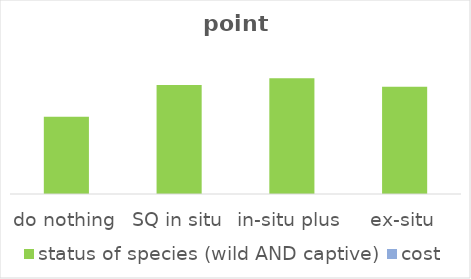
| Category | status of species (wild AND captive) | cost |
|---|---|---|
| do nothing | 0.518 | 0 |
| SQ in situ | 0.731 | 0 |
| in-situ plus | 0.777 | 0 |
| ex-situ | 0.719 | 0 |